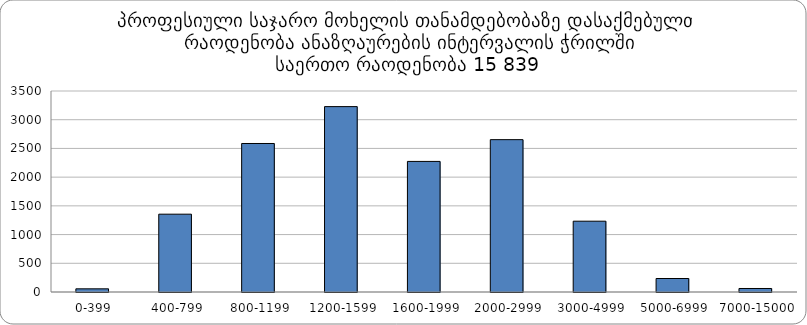
| Category | Sum |
|---|---|
|  0-399 | 55 |
|  400-799 | 1355 |
|  800-1199 | 2586 |
|  1200-1599 | 3228 |
|  1600-1999 | 2274 |
|  2000-2999 | 2653 |
|  3000-4999 | 1233 |
|  5000-6999 | 235 |
|  7000-15000 | 61 |